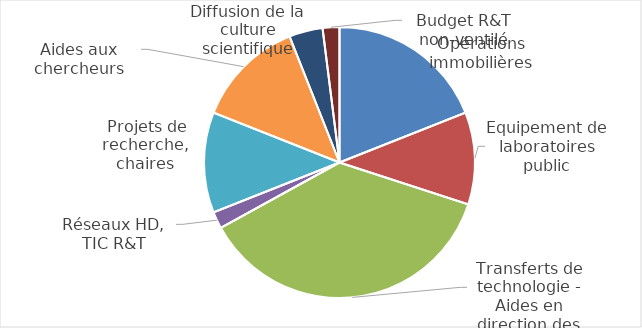
| Category | 19% |
|---|---|
| Opérations immobilières | 0.19 |
| Equipement de laboratoires public | 0.11 |
| Transferts de technologie - Aides en direction des entreprises innovantes | 0.37 |
| Réseaux HD, TIC R&T | 0.02 |
|  Projets de recherche, chaires | 0.12 |
| Aides aux chercheurs | 0.13 |
| Diffusion de la culture scientifique | 0.04 |
| Budget R&T non-ventilé | 0.02 |